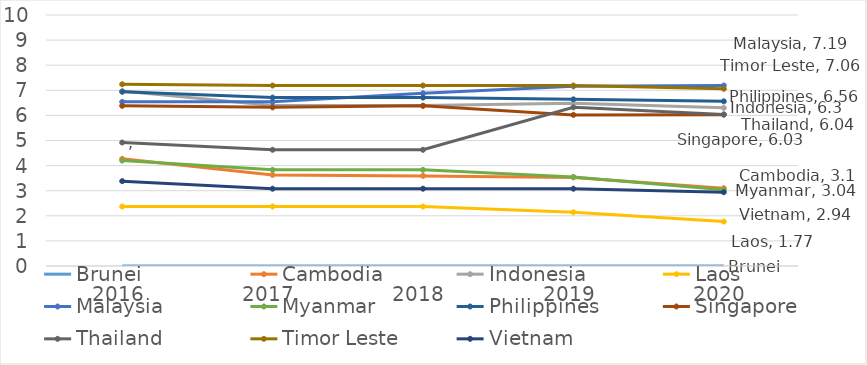
| Category | Brunei | Cambodia | Indonesia | Laos | Malaysia | Myanmar | Philippines | Singapore | Thailand | Timor Leste | Vietnam |
|---|---|---|---|---|---|---|---|---|---|---|---|
| 2016.0 | 0 | 4.27 | 6.97 | 2.37 | 6.54 | 4.2 | 6.94 | 6.38 | 4.92 | 7.24 | 3.38 |
| 2017.0 | 0 | 3.63 | 6.39 | 2.37 | 6.54 | 3.83 | 6.71 | 6.32 | 4.63 | 7.19 | 3.08 |
| 2018.0 | 0 | 3.59 | 6.39 | 2.37 | 6.88 | 3.83 | 6.71 | 6.38 | 4.63 | 7.19 | 3.08 |
| 2019.0 | 0 | 3.53 | 6.48 | 2.14 | 7.16 | 3.55 | 6.64 | 6.02 | 6.32 | 7.19 | 3.08 |
| 2020.0 | 0 | 3.1 | 6.3 | 1.77 | 7.19 | 3.04 | 6.56 | 6.03 | 6.04 | 7.06 | 2.94 |